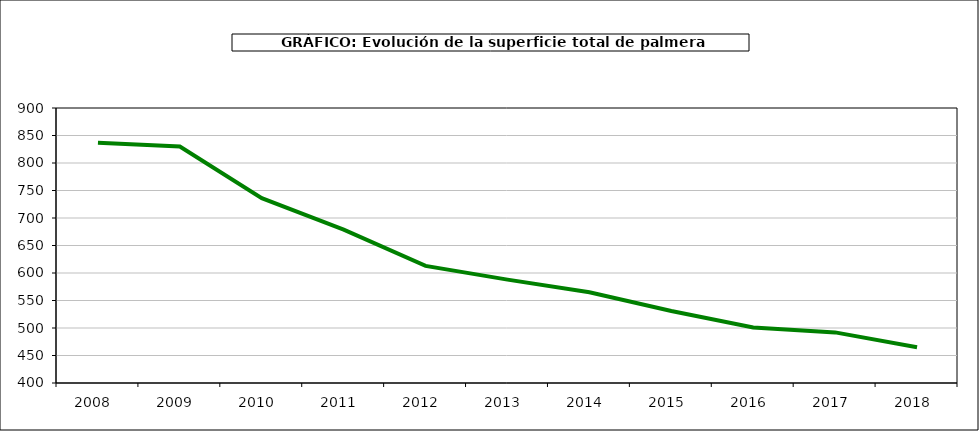
| Category | superficie kiwi |
|---|---|
| 2008.0 | 837 |
| 2009.0 | 830 |
| 2010.0 | 736 |
| 2011.0 | 679 |
| 2012.0 | 613 |
| 2013.0 | 588 |
| 2014.0 | 565 |
| 2015.0 | 531 |
| 2016.0 | 501 |
| 2017.0 | 492 |
| 2018.0 | 465 |